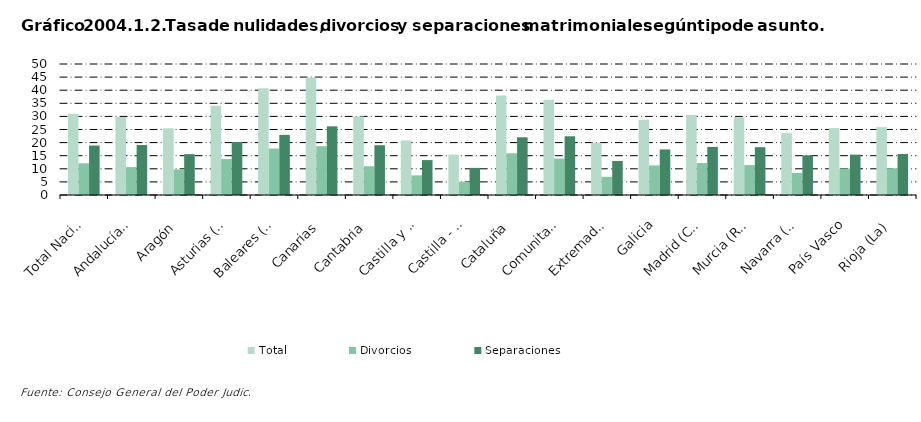
| Category | Total | Divorcios | Separaciones |
|---|---|---|---|
| Total Nacional | 31.012 | 12.089 | 18.879 |
| Andalucía(1) | 29.771 | 10.655 | 19.069 |
| Aragón | 25.448 | 9.779 | 15.597 |
| Asturias (Principado de) | 34.021 | 13.727 | 20.247 |
| Baleares (Illes) | 40.752 | 17.737 | 22.962 |
| Canarias | 44.891 | 18.627 | 26.212 |
| Cantabria | 29.994 | 10.977 | 18.998 |
| Castilla y León | 20.839 | 7.498 | 13.328 |
| Castilla - La Mancha | 15.431 | 5.063 | 10.347 |
| Cataluña | 37.996 | 15.922 | 22.025 |
| Comunitat Valenciana | 36.388 | 13.913 | 22.413 |
| Extremadura | 19.948 | 6.938 | 12.992 |
| Galicia | 28.746 | 11.301 | 17.386 |
| Madrid (Comunidad de) | 30.583 | 12.186 | 18.359 |
| Murcia (Región de) | 29.706 | 11.424 | 18.251 |
| Navarra (Comunidad Foral de) | 23.618 | 8.431 | 15.152 |
| País Vasco | 25.538 | 10.089 | 15.416 |
| Rioja (La) | 25.89 | 10.22 | 15.67 |